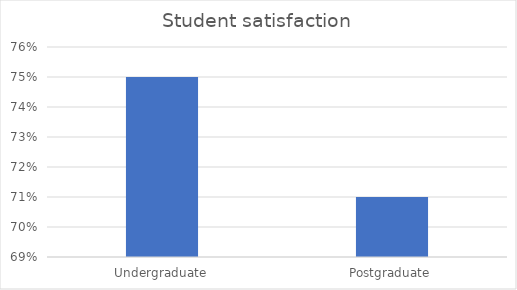
| Category | Student satisfaction |
|---|---|
| Undergraduate | 0.75 |
| Postgraduate | 0.71 |